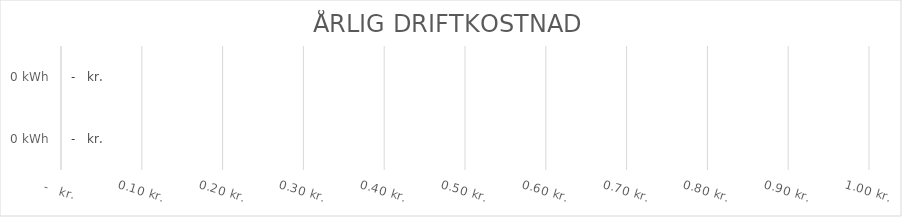
| Category | ÅRLIG ENERGIKOSTNAD KR./KWH  |
|---|---|
| 0.0 | 0 |
| 0.0 | 0 |